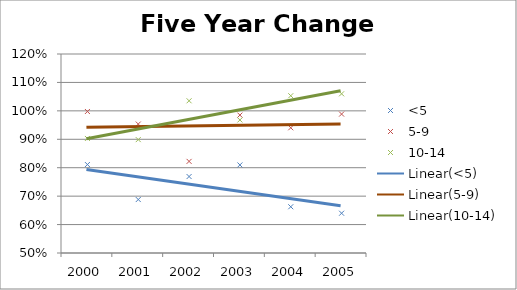
| Category | <5 | 5-9 | 10-14 |
|---|---|---|---|
| 2000.0 | 0.811 | 0.998 | 0.903 |
| 2001.0 | 0.688 | 0.954 | 0.899 |
| 2002.0 | 0.769 | 0.822 | 1.035 |
| 2003.0 | 0.81 | 0.985 | 0.968 |
| 2004.0 | 0.663 | 0.94 | 1.053 |
| 2005.0 | 0.64 | 0.989 | 1.06 |